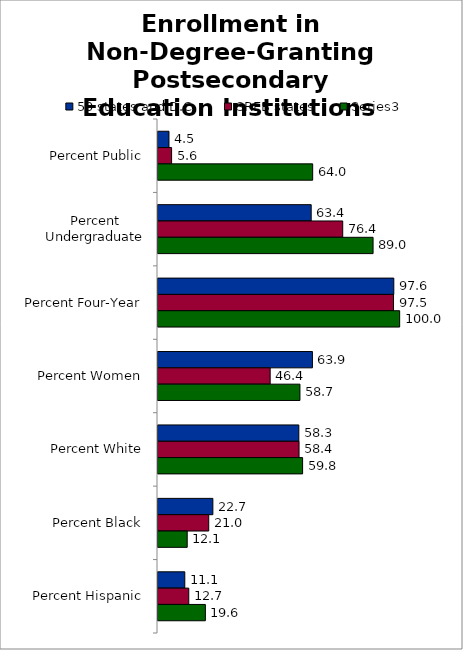
| Category | 50 states and D.C. | SREB states | Series 2 |
|---|---|---|---|
| Percent Public | 4.545 | 5.625 | 64.004 |
| Percent Undergraduate | 63.393 | 76.439 | 88.996 |
| Percent Four-Year | 97.571 | 97.455 | 100 |
| Percent Women | 63.903 | 46.418 | 58.738 |
| Percent White | 58.278 | 58.365 | 59.835 |
| Percent Black | 22.702 | 20.999 | 12.085 |
| Percent Hispanic | 11.084 | 12.733 | 19.598 |